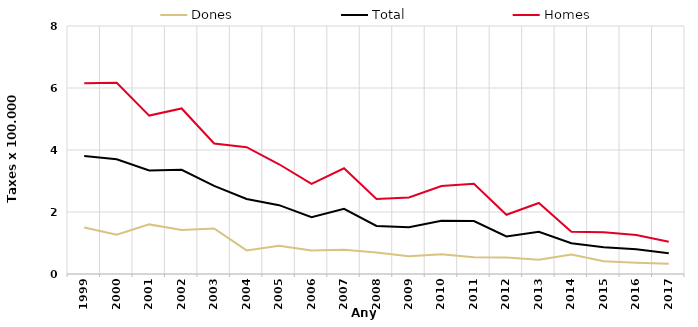
| Category | Dones | Total | Homes |
|---|---|---|---|
| 1999.0 | 1.5 | 3.81 | 6.15 |
| 2000.0 | 1.27 | 3.7 | 6.17 |
| 2001.0 | 1.6 | 3.34 | 5.11 |
| 2002.0 | 1.42 | 3.36 | 5.34 |
| 2003.0 | 1.47 | 2.84 | 4.21 |
| 2004.0 | 0.76 | 2.42 | 4.09 |
| 2005.0 | 0.91 | 2.22 | 3.54 |
| 2006.0 | 0.76 | 1.83 | 2.91 |
| 2007.0 | 0.78 | 2.1 | 3.41 |
| 2008.0 | 0.69 | 1.55 | 2.42 |
| 2009.0 | 0.57 | 1.51 | 2.47 |
| 2010.0 | 0.64 | 1.72 | 2.84 |
| 2011.0 | 0.54 | 1.71 | 2.91 |
| 2012.0 | 0.53 | 1.21 | 1.91 |
| 2013.0 | 0.46 | 1.36 | 2.29 |
| 2014.0 | 0.63 | 0.99 | 1.36 |
| 2015.0 | 0.41 | 0.86 | 1.35 |
| 2016.0 | 0.36 | 0.8 | 1.26 |
| 2017.0 | 0.33 | 0.67 | 1.04 |